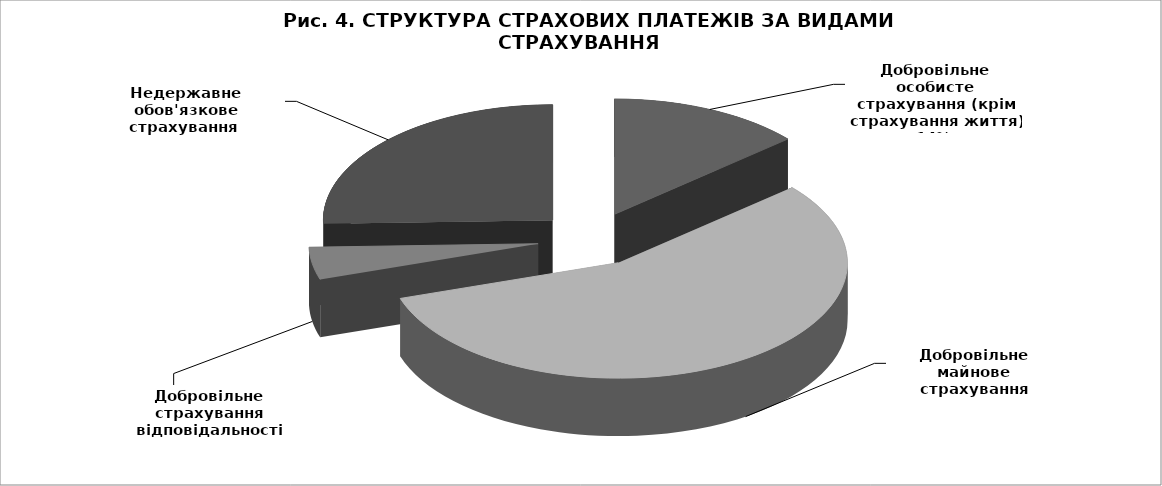
| Category | Series 0 |
|---|---|
| Добровільне особисте страхування (крім страхування життя) | 701874.1 |
| Добровільне майнове страхування | 2892400.8 |
| Добровільне страхування відповідальності | 232422 |
| Недержавне обов'язкове страхування  | 1308628.5 |